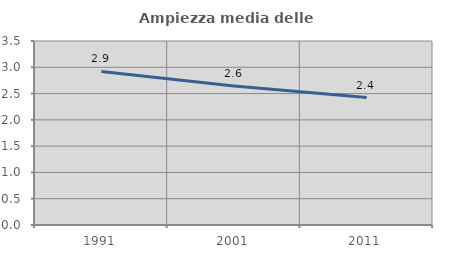
| Category | Ampiezza media delle famiglie |
|---|---|
| 1991.0 | 2.92 |
| 2001.0 | 2.645 |
| 2011.0 | 2.425 |